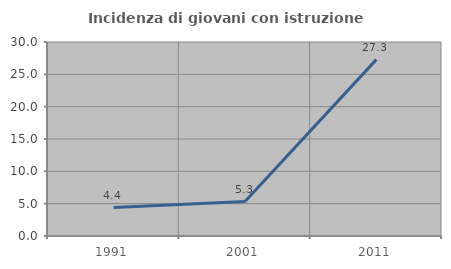
| Category | Incidenza di giovani con istruzione universitaria |
|---|---|
| 1991.0 | 4.396 |
| 2001.0 | 5.333 |
| 2011.0 | 27.273 |